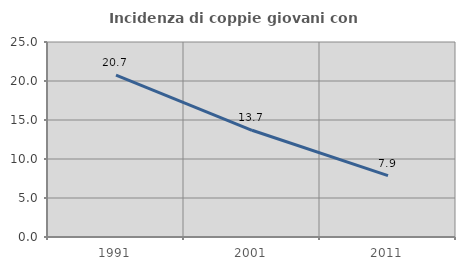
| Category | Incidenza di coppie giovani con figli |
|---|---|
| 1991.0 | 20.746 |
| 2001.0 | 13.68 |
| 2011.0 | 7.873 |